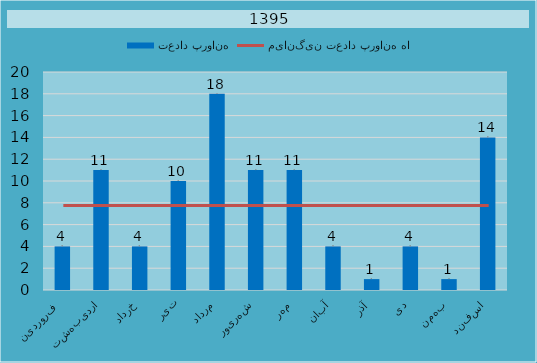
| Category | تعداد پروانه |
|---|---|
| فروردین  | 4 |
| اردیبهشت | 11 |
| خرداد | 4 |
| تیر | 10 |
| مرداد | 18 |
| شهریور | 11 |
| مهر | 11 |
| آبان | 4 |
| آذر | 1 |
| دی | 4 |
| بهمن | 1 |
| اسفند | 14 |